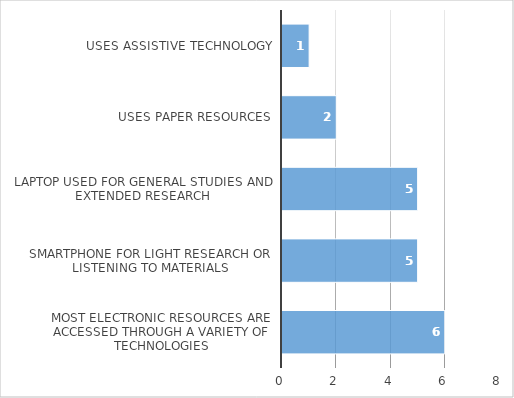
| Category | Series 0 |
|---|---|
| Most electronic resources are accessed through a variety of technologies | 6 |
| Smartphone for light research or listening to materials | 5 |
| Laptop used for general studies and extended research | 5 |
| Uses paper resources | 2 |
| Uses assistive technology | 1 |